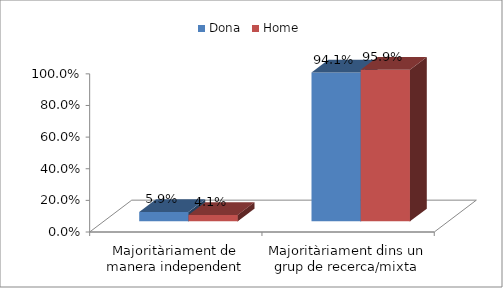
| Category | Dona | Home |
|---|---|---|
| Majoritàriament de manera independent | 0.059 | 0.041 |
| Majoritàriament dins un grup de recerca/mixta | 0.941 | 0.959 |